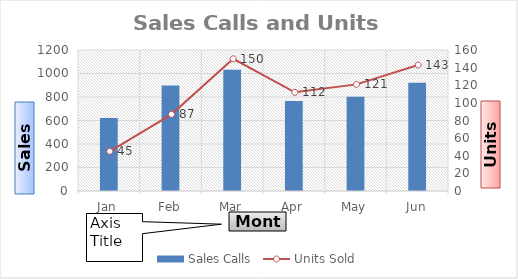
| Category | Sales Calls |
|---|---|
| Jan | 621 |
| Feb | 897 |
| Mar | 1032 |
| Apr | 765 |
| May | 802 |
| Jun | 921 |